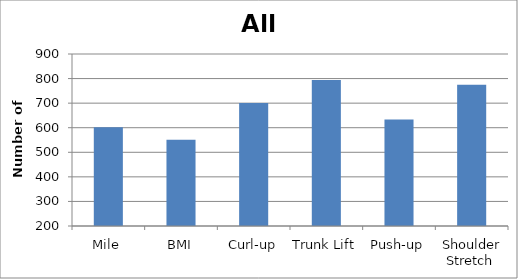
| Category | Pass |
|---|---|
| Mile | 602 |
| BMI | 551 |
| Curl-up | 701 |
| Trunk Lift | 794 |
| Push-up | 633 |
| Shoulder Stretch  | 775 |